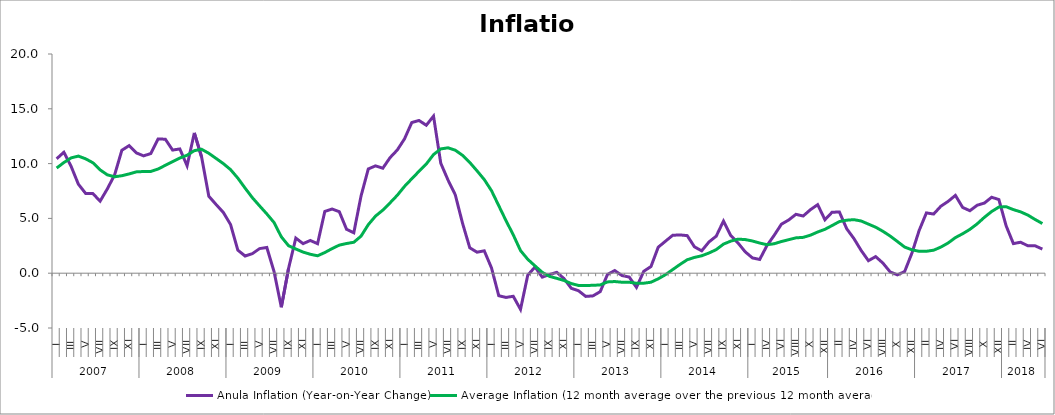
| Category | Anula Inflation (Year-on-Year Change) | Average Inflation (12 month average over the previous 12 month average) |
|---|---|---|
| 0 | 10.438 | 9.597 |
| 1 | 11.037 | 10.095 |
| 2 | 9.747 | 10.522 |
| 3 | 8.122 | 10.685 |
| 4 | 7.281 | 10.437 |
| 5 | 7.263 | 10.079 |
| 6 | 6.574 | 9.429 |
| 7 | 7.699 | 8.974 |
| 8 | 8.969 | 8.798 |
| 9 | 11.218 | 8.895 |
| 10 | 11.64 | 9.057 |
| 11 | 10.975 | 9.245 |
| 12 | 10.707 | 9.279 |
| 13 | 10.919 | 9.283 |
| 14 | 12.25 | 9.503 |
| 15 | 12.224 | 9.846 |
| 16 | 11.235 | 10.174 |
| 17 | 11.337 | 10.508 |
| 18 | 9.804 | 10.764 |
| 19 | 12.799 | 11.182 |
| 20 | 10.605 | 11.308 |
| 21 | 7.02 | 10.938 |
| 22 | 6.267 | 10.471 |
| 23 | 5.548 | 9.999 |
| 24 | 4.441 | 9.447 |
| 25 | 2.094 | 8.674 |
| 26 | 1.572 | 7.765 |
| 27 | 1.785 | 6.892 |
| 28 | 2.242 | 6.143 |
| 29 | 2.347 | 5.409 |
| 30 | 0.141 | 4.621 |
| 31 | -3.106 | 3.318 |
| 32 | 0.44 | 2.508 |
| 33 | 3.203 | 2.209 |
| 34 | 2.697 | 1.927 |
| 35 | 2.986 | 1.728 |
| 36 | 2.693 | 1.589 |
| 37 | 5.633 | 1.886 |
| 38 | 5.858 | 2.242 |
| 39 | 5.612 | 2.561 |
| 40 | 4.006 | 2.709 |
| 41 | 3.689 | 2.822 |
| 42 | 7.048 | 3.383 |
| 43 | 9.512 | 4.43 |
| 44 | 9.794 | 5.213 |
| 45 | 9.576 | 5.753 |
| 46 | 10.542 | 6.417 |
| 47 | 11.241 | 7.111 |
| 48 | 12.26 | 7.923 |
| 49 | 13.747 | 8.617 |
| 50 | 13.936 | 9.3 |
| 51 | 13.499 | 9.961 |
| 52 | 14.332 | 10.824 |
| 53 | 10.034 | 11.341 |
| 54 | 8.499 | 11.44 |
| 55 | 7.154 | 11.224 |
| 56 | 4.562 | 10.754 |
| 57 | 2.318 | 10.102 |
| 58 | 1.917 | 9.34 |
| 59 | 2.041 | 8.543 |
| 60 | 0.478 | 7.527 |
| 61 | -2.055 | 6.159 |
| 62 | -2.211 | 4.793 |
| 63 | -2.105 | 3.5 |
| 64 | -3.3 | 2.066 |
| 65 | -0.18 | 1.269 |
| 66 | 0.565 | 0.665 |
| 67 | -0.359 | 0.081 |
| 68 | -0.121 | -0.289 |
| 69 | 0.078 | -0.469 |
| 70 | -0.487 | -0.664 |
| 71 | -1.373 | -0.944 |
| 72 | -1.6 | -1.117 |
| 73 | -2.117 | -1.12 |
| 74 | -2.069 | -1.106 |
| 75 | -1.678 | -1.069 |
| 76 | -0.112 | -0.796 |
| 77 | 0.241 | -0.761 |
| 78 | -0.212 | -0.824 |
| 79 | -0.353 | -0.824 |
| 80 | -1.294 | -0.921 |
| 81 | 0.173 | -0.913 |
| 82 | 0.607 | -0.823 |
| 83 | 2.372 | -0.512 |
| 84 | 2.92 | -0.135 |
| 85 | 3.461 | 0.332 |
| 86 | 3.492 | 0.798 |
| 87 | 3.429 | 1.227 |
| 88 | 2.405 | 1.439 |
| 89 | 2.042 | 1.589 |
| 90 | 2.85 | 1.842 |
| 91 | 3.377 | 2.15 |
| 92 | 4.752 | 2.653 |
| 93 | 3.441 | 2.926 |
| 94 | 2.764 | 3.106 |
| 95 | 1.952 | 3.069 |
| 96 | 1.394 | 2.938 |
| 97 | 1.254 | 2.752 |
| 98 | 2.517 | 2.599 |
| 99 | 3.459 | 2.688 |
| 100 | 4.474 | 2.891 |
| 101 | 4.855 | 3.058 |
| 102 | 5.372 | 3.225 |
| 103 | 5.217 | 3.27 |
| 104 | 5.795 | 3.469 |
| 105 | 6.254 | 3.76 |
| 106 | 4.879 | 4.004 |
| 107 | 5.571 | 4.353 |
| 108 | 5.575 | 4.713 |
| 109 | 4.061 | 4.836 |
| 110 | 3.159 | 4.886 |
| 111 | 2.073 | 4.763 |
| 112 | 1.142 | 4.478 |
| 113 | 1.513 | 4.196 |
| 114 | 0.922 | 3.822 |
| 115 | 0.116 | 3.391 |
| 116 | -0.152 | 2.891 |
| 117 | 0.154 | 2.384 |
| 118 | 1.832 | 2.135 |
| 119 | 3.9 | 2 |
| 120 | 5.5 | 2 |
| 121 | 5.4 | 2.1 |
| 122 | 6.115 | 2.385 |
| 123 | 6.556 | 2.758 |
| 124 | 7.1 | 3.247 |
| 125 | 6 | 3.6 |
| 126 | 5.7 | 4 |
| 127 | 6.2 | 4.5 |
| 128 | 6.4 | 5.1 |
| 129 | 6.931 | 5.627 |
| 130 | 6.716 | 6.035 |
| 131 | 4.321 | 6.067 |
| 132 | 2.7 | 5.8 |
| 133 | 2.827 | 5.596 |
| 134 | 2.5 | 5.3 |
| 135 | 2.5 | 4.9 |
| 136 | 2.199 | 4.531 |